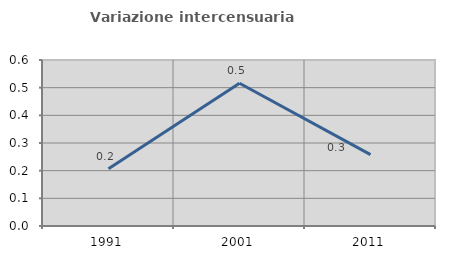
| Category | Variazione intercensuaria annua |
|---|---|
| 1991.0 | 0.207 |
| 2001.0 | 0.516 |
| 2011.0 | 0.258 |